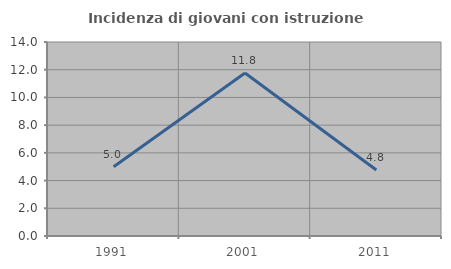
| Category | Incidenza di giovani con istruzione universitaria |
|---|---|
| 1991.0 | 5 |
| 2001.0 | 11.765 |
| 2011.0 | 4.762 |